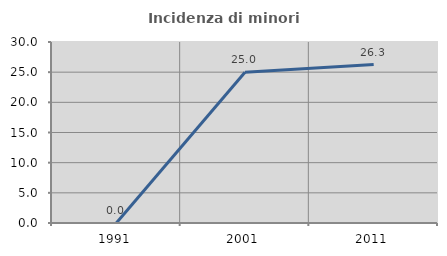
| Category | Incidenza di minori stranieri |
|---|---|
| 1991.0 | 0 |
| 2001.0 | 25 |
| 2011.0 | 26.263 |